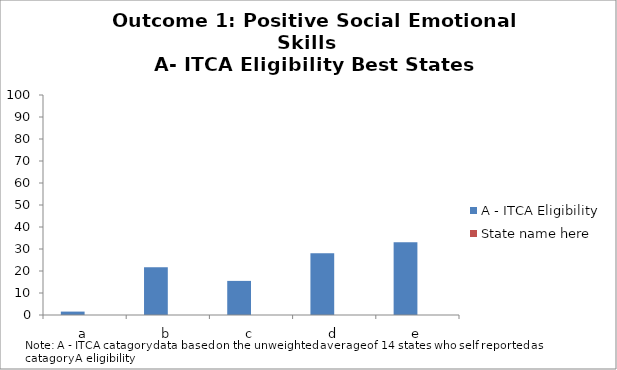
| Category | A - ITCA Eligibility | State name here |
|---|---|---|
| a | 1.55 |  |
| b | 21.7 |  |
| c | 15.5 |  |
| d | 28.1 |  |
| e | 33.1 |  |